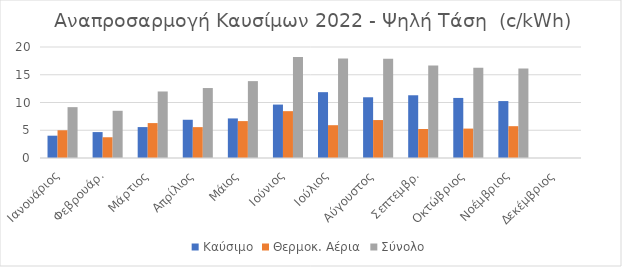
| Category | Καύσιμο | Θερμοκ. Αέρια | Σύνολο |
|---|---|---|---|
| Ιανουάριος | 4.02 | 4.996 | 9.163 |
| Φεβρουάρ. | 4.67 | 3.738 | 8.506 |
| Μάρτιος | 5.571 | 6.291 | 11.986 |
| Απρίλιος | 6.89 | 5.562 | 12.606 |
| Μάιος | 7.13 | 6.649 | 13.852 |
| Ιούνιος | 9.626 | 8.44 | 18.192 |
| Ιούλιος | 11.861 | 5.91 | 17.936 |
| Αύγουστος | 10.941 | 6.838 | 17.904 |
| Σεπτεμβρ. | 11.303 | 5.221 | 16.658 |
| Οκτώβριος | 10.824 | 5.298 | 16.264 |
| Νοέμβριος | 10.257 | 5.733 | 16.114 |
| Δεκέμβριος | 0 | 0 | 0 |